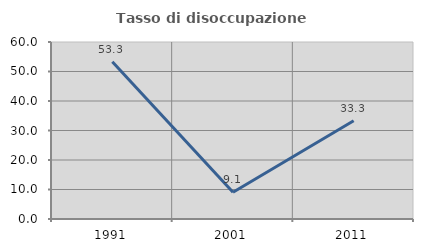
| Category | Tasso di disoccupazione giovanile  |
|---|---|
| 1991.0 | 53.333 |
| 2001.0 | 9.091 |
| 2011.0 | 33.333 |